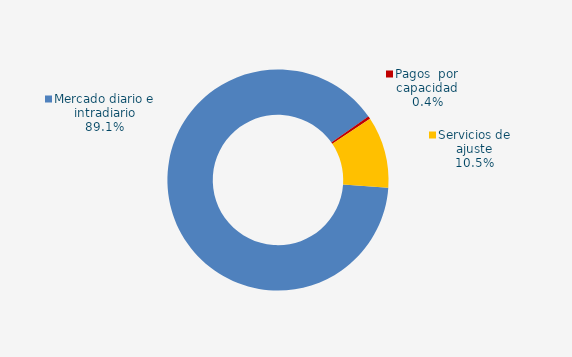
| Category | Series 0 |
|---|---|
| Mercado diario e intradiario | 76.88 |
| Pagos  por capacidad | 0.35 |
| Mecanismo ajuste RD-L 10/2022 | 0 |
| Servicios de ajuste | 9.02 |